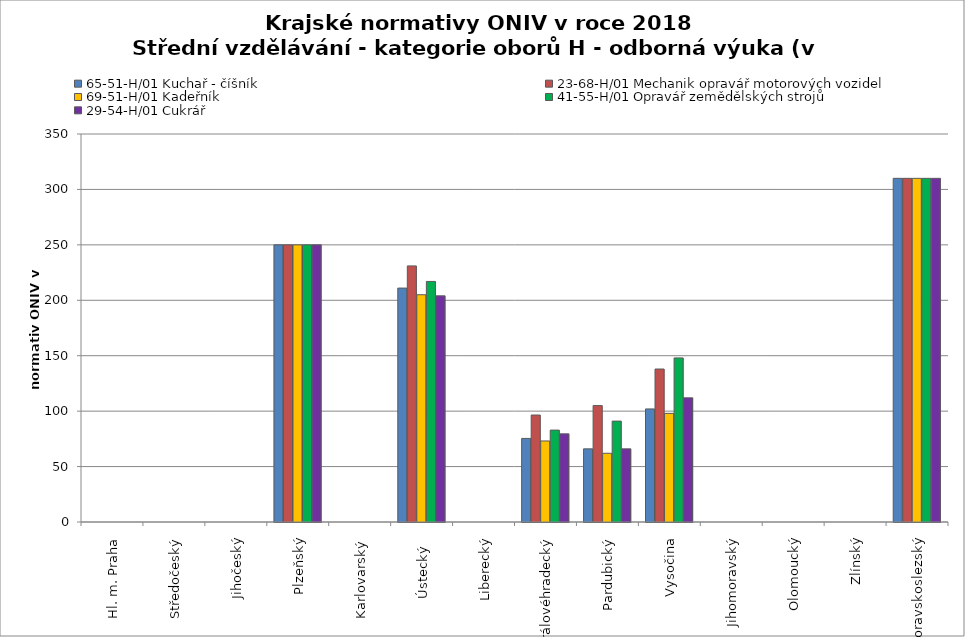
| Category | 65-51-H/01 Kuchař - číšník | 23-68-H/01 Mechanik opravář motorových vozidel | 69-51-H/01 Kadeřník | 41-55-H/01 Opravář zemědělských strojů | 29-54-H/01 Cukrář |
|---|---|---|---|---|---|
| Hl. m. Praha | 0 | 0 | 0 | 0 | 0 |
| Středočeský | 0 | 0 | 0 | 0 | 0 |
| Jihočeský | 0 | 0 | 0 | 0 | 0 |
| Plzeňský | 250 | 250 | 250 | 250 | 250 |
| Karlovarský  | 0 | 0 | 0 | 0 | 0 |
| Ústecký   | 211 | 231 | 205 | 217 | 204 |
| Liberecký | 0 | 0 | 0 | 0 | 0 |
| Královéhradecký | 75.4 | 96.5 | 73.1 | 82.9 | 79.5 |
| Pardubický | 66 | 105 | 62 | 91 | 66 |
| Vysočina | 102 | 138 | 98 | 148 | 112 |
| Jihomoravský | 0 | 0 | 0 | 0 | 0 |
| Olomoucký | 0 | 0 | 0 | 0 | 0 |
| Zlínský | 0 | 0 | 0 | 0 | 0 |
| Moravskoslezský | 310 | 310 | 310 | 310 | 310 |